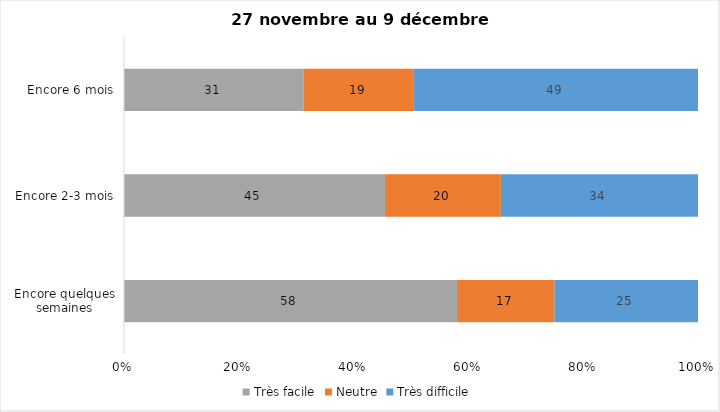
| Category | Très facile | Neutre | Très difficile |
|---|---|---|---|
| Encore quelques semaines | 58 | 17 | 25 |
| Encore 2-3 mois | 45 | 20 | 34 |
| Encore 6 mois | 31 | 19 | 49 |